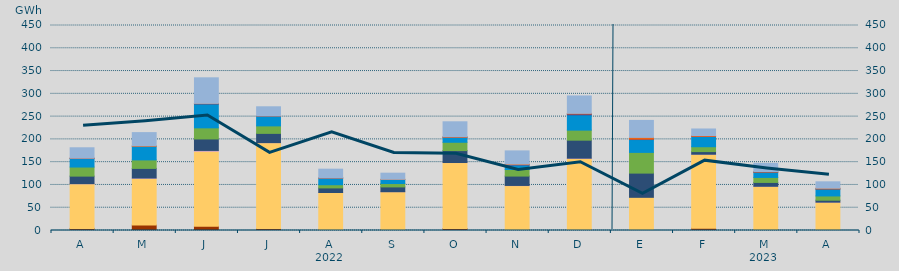
| Category | Carbón | Ciclo Combinado | Cogeneración | Consumo Bombeo | Eólica | Hidráulica | Nuclear | Otras Renovables | Solar fotovoltaica | Solar térmica | Turbinación bombeo |
|---|---|---|---|---|---|---|---|---|---|---|---|
| A | 4593.5 | 97889.1 | 405.8 | 16475.5 | 19937.3 | 18601.3 | 663.3 | 0 | 233.1 | 0 | 22786.5 |
| M | 11875.65 | 102430.975 | 928.85 | 21079.775 | 18647.725 | 29842.925 | 0 | 0 | 1098.75 | 0 | 29000.65 |
| J | 9138.825 | 164797.65 | 1808.4 | 25204.95 | 24371.3 | 52553.275 | 599.625 | 0 | 596 | 0 | 56106.775 |
| J | 4302 | 188455.5 | 190.325 | 20249.475 | 16437.65 | 21832.925 | 50 | 0 | 230.625 | 0 | 19818.55 |
| A | 2452.3 | 80908.85 | 69.8 | 10038.425 | 6983.45 | 14747.025 | 33 | 0 | 300.1 | 0 | 19076.4 |
| S | 2236 | 82926.675 | 23 | 10509.975 | 7386.425 | 8900.725 | 0 | 0 | 476.125 | 0 | 13369.775 |
| O | 4283 | 144842.475 | 127.925 | 26134.8 | 18277.325 | 11041.025 | 22.5 | 0 | 1111.175 | 0 | 32778.95 |
| N | 861.375 | 97623.7 | 419.15 | 20591.575 | 14440 | 9978.175 | 722.075 | 1 | 1239.075 | 0 | 28866.575 |
| D | 2372.95 | 155746.55 | 697.65 | 39478.975 | 22031.425 | 33537.4 | 2006.425 | 0 | 1334.875 | 0 | 38128.575 |
| E | 1284.5 | 71547.4 | 0 | 53164.775 | 45462.95 | 28173.35 | 832.7 | 0 | 3920.525 | 0 | 37262.825 |
| F | 5209.75 | 162258.025 | 4.5 | 5734.4 | 10650.1 | 22890.65 | 0 | 26 | 1697.2 | 0 | 14370.575 |
| M | 1206.25 | 95878.75 | 28.525 | 8412.525 | 10950.5 | 11649.375 | 291.075 | 0 | 997.65 | 0 | 18026.625 |
| A | 95 | 62173.25 | 34.425 | 4159.95 | 9407.775 | 15400.95 | 65.5 | 0 | 1513.55 | 0 | 13985.1 |